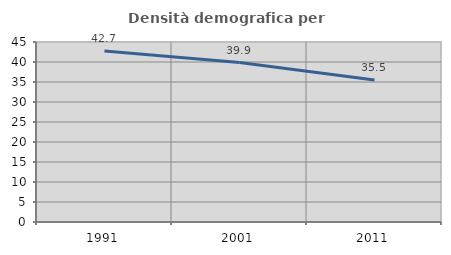
| Category | Densità demografica |
|---|---|
| 1991.0 | 42.728 |
| 2001.0 | 39.855 |
| 2011.0 | 35.51 |